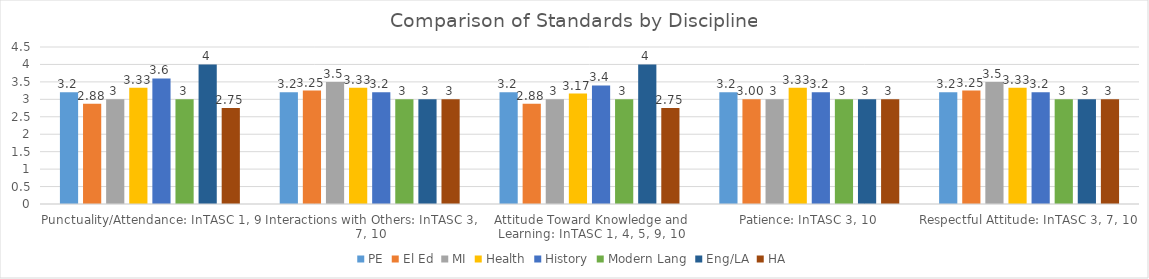
| Category | PE | El Ed | MI | Health | History | Modern Lang | Eng/LA | HA |
|---|---|---|---|---|---|---|---|---|
| Punctuality/Attendance: InTASC 1, 9 | 3.2 | 2.875 | 3 | 3.333 | 3.6 | 3 | 4 | 2.75 |
| Interactions with Others: InTASC 3, 7, 10 | 3.2 | 3.25 | 3.5 | 3.333 | 3.2 | 3 | 3 | 3 |
| Attitude Toward Knowledge and Learning: InTASC 1, 4, 5, 9, 10 | 3.2 | 2.875 | 3 | 3.167 | 3.4 | 3 | 4 | 2.75 |
| Patience: InTASC 3, 10 | 3.2 | 3 | 3 | 3.333 | 3.2 | 3 | 3 | 3 |
| Respectful Attitude: InTASC 3, 7, 10 | 3.2 | 3.25 | 3.5 | 3.333 | 3.2 | 3 | 3 | 3 |